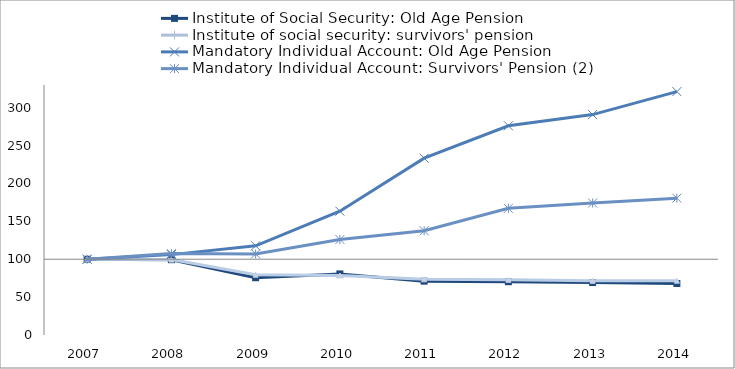
| Category | Basic Solidarity Pension: old-age pension | Institute of Social Security: Old Age Pension | Institute of social security: survivors' pension | Institute of Social Security: Survivors Pension | Special Laws Pensions - Political victims | Mandatory Individual Account: Old Age Pension | Mandatory Individual Account: Survivors' Pension (2) |
|---|---|---|---|---|---|---|---|
| 2007.0 |  | 100 |  | 100 |  | 100 | 100 |
| 2008.0 |  | 99.409 |  | 99.574 |  | 106.093 | 107.44 |
| 2009.0 |  | 75.599 |  | 79.594 |  | 117.765 | 107.074 |
| 2010.0 |  | 80.63 |  | 78.533 |  | 163.413 | 126.067 |
| 2011.0 |  | 71.042 |  | 73.491 |  | 233.413 | 137.653 |
| 2012.0 |  | 70.35 |  | 72.89 |  | 276.175 | 167.246 |
| 2013.0 |  | 69.256 |  | 71.541 |  | 290.943 | 174.231 |
| 2014.0 |  | 67.987 |  | 71.728 |  | 321.295 | 180.656 |